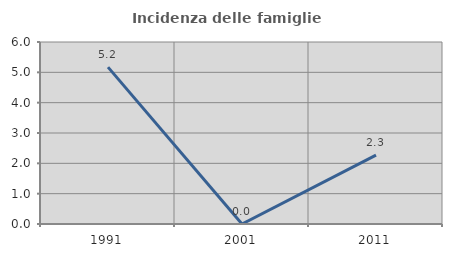
| Category | Incidenza delle famiglie numerose |
|---|---|
| 1991.0 | 5.172 |
| 2001.0 | 0 |
| 2011.0 | 2.273 |